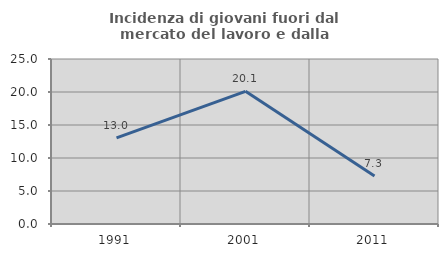
| Category | Incidenza di giovani fuori dal mercato del lavoro e dalla formazione  |
|---|---|
| 1991.0 | 13.043 |
| 2001.0 | 20.098 |
| 2011.0 | 7.263 |